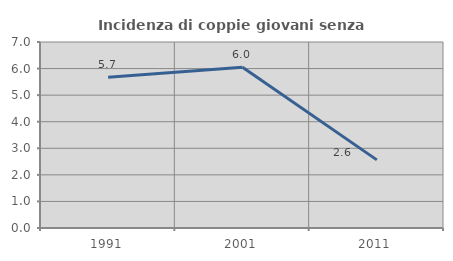
| Category | Incidenza di coppie giovani senza figli |
|---|---|
| 1991.0 | 5.674 |
| 2001.0 | 6.047 |
| 2011.0 | 2.564 |